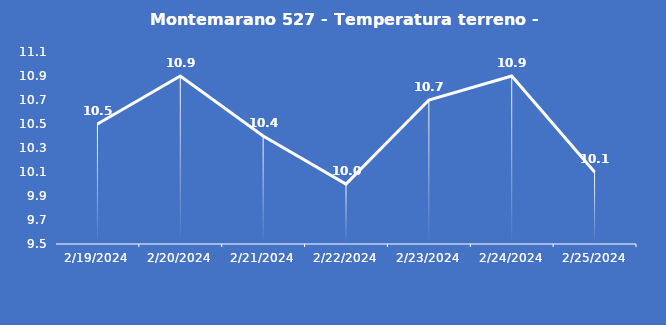
| Category | Montemarano 527 - Temperatura terreno - Grezzo (°C) |
|---|---|
| 2/19/24 | 10.5 |
| 2/20/24 | 10.9 |
| 2/21/24 | 10.4 |
| 2/22/24 | 10 |
| 2/23/24 | 10.7 |
| 2/24/24 | 10.9 |
| 2/25/24 | 10.1 |